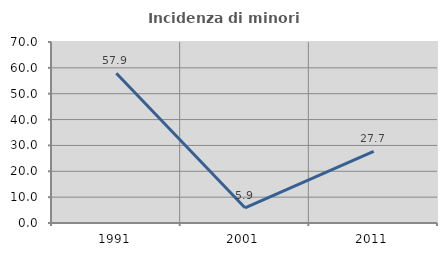
| Category | Incidenza di minori stranieri |
|---|---|
| 1991.0 | 57.895 |
| 2001.0 | 5.882 |
| 2011.0 | 27.66 |